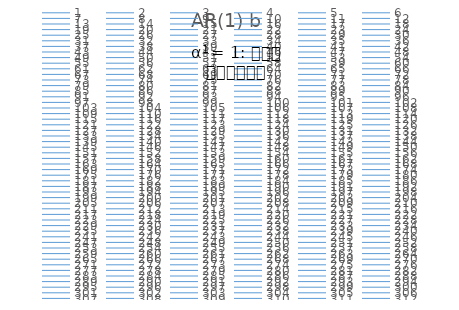
| Category | AR(1) b |
|---|---|
| 0 | 0 |
| 1 | 1.015 |
| 2 | 2.593 |
| 3 | 2.613 |
| 4 | 2.756 |
| 5 | 2.934 |
| 6 | 4.129 |
| 7 | 6.879 |
| 8 | 7.915 |
| 9 | 8.024 |
| 10 | 7.977 |
| 11 | 9.688 |
| 12 | 10.634 |
| 13 | 13.068 |
| 14 | 12.86 |
| 15 | 14.144 |
| 16 | 14.77 |
| 17 | 15.892 |
| 18 | 17.696 |
| 19 | 19.677 |
| 20 | 19.577 |
| 21 | 20.806 |
| 22 | 23.309 |
| 23 | 25.277 |
| 24 | 25.782 |
| 25 | 26.031 |
| 26 | 27.326 |
| 27 | 28.076 |
| 28 | 28.347 |
| 29 | 29.33 |
| 30 | 29.874 |
| 31 | 32.048 |
| 32 | 32.278 |
| 33 | 34.34 |
| 34 | 34.075 |
| 35 | 35.875 |
| 36 | 36.606 |
| 37 | 37.714 |
| 38 | 39.225 |
| 39 | 39.424 |
| 40 | 41.087 |
| 41 | 42.176 |
| 42 | 44.3 |
| 43 | 45.923 |
| 44 | 45.345 |
| 45 | 45.836 |
| 46 | 47.448 |
| 47 | 49.333 |
| 48 | 50.348 |
| 49 | 51.664 |
| 50 | 52.429 |
| 51 | 54.421 |
| 52 | 53.68 |
| 53 | 55.277 |
| 54 | 54.174 |
| 55 | 53.319 |
| 56 | 55.16 |
| 57 | 56.703 |
| 58 | 56.704 |
| 59 | 58.004 |
| 60 | 59.103 |
| 61 | 59.945 |
| 62 | 61.201 |
| 63 | 62.656 |
| 64 | 64.447 |
| 65 | 66.275 |
| 66 | 65.46 |
| 67 | 66.07 |
| 68 | 67.342 |
| 69 | 69.643 |
| 70 | 70.446 |
| 71 | 73.72 |
| 72 | 72.92 |
| 73 | 76.219 |
| 74 | 79.67 |
| 75 | 79.974 |
| 76 | 79.443 |
| 77 | 79.032 |
| 78 | 78.002 |
| 79 | 78.132 |
| 80 | 78.802 |
| 81 | 78.874 |
| 82 | 81.328 |
| 83 | 80.793 |
| 84 | 80.475 |
| 85 | 81.415 |
| 86 | 81.082 |
| 87 | 80.557 |
| 88 | 81.038 |
| 89 | 81.041 |
| 90 | 80.212 |
| 91 | 78.915 |
| 92 | 79.324 |
| 93 | 79.757 |
| 94 | 79.285 |
| 95 | 80.2 |
| 96 | 82.003 |
| 97 | 84.117 |
| 98 | 85.619 |
| 99 | 87.647 |
| 100 | 88.445 |
| 101 | 89.063 |
| 102 | 89.765 |
| 103 | 89.927 |
| 104 | 91.415 |
| 105 | 93.656 |
| 106 | 92.761 |
| 107 | 91.931 |
| 108 | 93.008 |
| 109 | 93.641 |
| 110 | 94.167 |
| 111 | 94.941 |
| 112 | 96.246 |
| 113 | 97.959 |
| 114 | 98.261 |
| 115 | 99.564 |
| 116 | 99.203 |
| 117 | 100.429 |
| 118 | 102.267 |
| 119 | 103.557 |
| 120 | 104.765 |
| 121 | 105.681 |
| 122 | 105.656 |
| 123 | 107.818 |
| 124 | 108.553 |
| 125 | 109.395 |
| 126 | 110.22 |
| 127 | 110.69 |
| 128 | 111.262 |
| 129 | 111.63 |
| 130 | 113.507 |
| 131 | 113.824 |
| 132 | 113.605 |
| 133 | 114.893 |
| 134 | 114.702 |
| 135 | 113.913 |
| 136 | 114.455 |
| 137 | 116.005 |
| 138 | 116.506 |
| 139 | 115.732 |
| 140 | 117.839 |
| 141 | 119.264 |
| 142 | 120.844 |
| 143 | 121.546 |
| 144 | 122.343 |
| 145 | 122.61 |
| 146 | 122.139 |
| 147 | 123.447 |
| 148 | 124.877 |
| 149 | 126.431 |
| 150 | 128.113 |
| 151 | 129.02 |
| 152 | 129.523 |
| 153 | 131.299 |
| 154 | 132.844 |
| 155 | 134.518 |
| 156 | 136.184 |
| 157 | 137.767 |
| 158 | 138.463 |
| 159 | 140.074 |
| 160 | 141.129 |
| 161 | 142.649 |
| 162 | 142.75 |
| 163 | 144.715 |
| 164 | 145.803 |
| 165 | 147.544 |
| 166 | 147.729 |
| 167 | 150.675 |
| 168 | 153.029 |
| 169 | 153.252 |
| 170 | 154.253 |
| 171 | 154.828 |
| 172 | 155.287 |
| 173 | 156.62 |
| 174 | 156.402 |
| 175 | 156.377 |
| 176 | 156.344 |
| 177 | 158.807 |
| 178 | 158.3 |
| 179 | 159.071 |
| 180 | 159.784 |
| 181 | 161.875 |
| 182 | 161.378 |
| 183 | 162.336 |
| 184 | 163.207 |
| 185 | 163.538 |
| 186 | 163.763 |
| 187 | 164.675 |
| 188 | 166.395 |
| 189 | 166.914 |
| 190 | 166.52 |
| 191 | 167.621 |
| 192 | 169.376 |
| 193 | 170.952 |
| 194 | 172.364 |
| 195 | 174.41 |
| 196 | 174.613 |
| 197 | 176.079 |
| 198 | 178.487 |
| 199 | 180.011 |
| 200 | 180.587 |
| 201 | 181.478 |
| 202 | 183.868 |
| 203 | 186.15 |
| 204 | 187.088 |
| 205 | 187.744 |
| 206 | 188.338 |
| 207 | 189.985 |
| 208 | 191.183 |
| 209 | 192.836 |
| 210 | 194.086 |
| 211 | 193.619 |
| 212 | 195.338 |
| 213 | 196.429 |
| 214 | 196.424 |
| 215 | 199.565 |
| 216 | 200.282 |
| 217 | 202.469 |
| 218 | 203.287 |
| 219 | 203.358 |
| 220 | 205.429 |
| 221 | 207.474 |
| 222 | 209.283 |
| 223 | 209.381 |
| 224 | 209.773 |
| 225 | 211.463 |
| 226 | 211.027 |
| 227 | 212.684 |
| 228 | 211.838 |
| 229 | 213.183 |
| 230 | 215.196 |
| 231 | 216.208 |
| 232 | 215.098 |
| 233 | 217.135 |
| 234 | 219.055 |
| 235 | 219.9 |
| 236 | 222.076 |
| 237 | 223.004 |
| 238 | 224.603 |
| 239 | 224.03 |
| 240 | 224.336 |
| 241 | 225.148 |
| 242 | 226.02 |
| 243 | 227.333 |
| 244 | 229.753 |
| 245 | 231.034 |
| 246 | 233.32 |
| 247 | 233.162 |
| 248 | 234.454 |
| 249 | 235.351 |
| 250 | 235.078 |
| 251 | 236.43 |
| 252 | 236.065 |
| 253 | 237.077 |
| 254 | 237.5 |
| 255 | 239.414 |
| 256 | 241.628 |
| 257 | 241.571 |
| 258 | 241.581 |
| 259 | 243.973 |
| 260 | 246.114 |
| 261 | 248.278 |
| 262 | 249.093 |
| 263 | 252.67 |
| 264 | 253.712 |
| 265 | 253.697 |
| 266 | 255.357 |
| 267 | 256.246 |
| 268 | 258.677 |
| 269 | 260.654 |
| 270 | 262.658 |
| 271 | 263.277 |
| 272 | 263.964 |
| 273 | 265.113 |
| 274 | 266.589 |
| 275 | 268.431 |
| 276 | 267.67 |
| 277 | 268.198 |
| 278 | 268.13 |
| 279 | 267.933 |
| 280 | 268.535 |
| 281 | 272.327 |
| 282 | 273.408 |
| 283 | 275.072 |
| 284 | 276.065 |
| 285 | 277.433 |
| 286 | 280.365 |
| 287 | 279.763 |
| 288 | 282.43 |
| 289 | 283.175 |
| 290 | 284.489 |
| 291 | 285.711 |
| 292 | 288.334 |
| 293 | 288.393 |
| 294 | 290.334 |
| 295 | 291.905 |
| 296 | 292.113 |
| 297 | 292 |
| 298 | 290.676 |
| 299 | 291.014 |
| 300 | 291.962 |
| 301 | 292.245 |
| 302 | 292.92 |
| 303 | 293.715 |
| 304 | 295.379 |
| 305 | 295.058 |
| 306 | 296.556 |
| 307 | 298.097 |
| 308 | 299.403 |
| 309 | 301.1 |
| 310 | 302.583 |
| 311 | 303.158 |
| 312 | 305.472 |
| 313 | 305.914 |
| 314 | 307.257 |
| 315 | 309.122 |
| 316 | 310.066 |
| 317 | 313.141 |
| 318 | 314.944 |
| 319 | 316.059 |
| 320 | 317.8 |
| 321 | 319.542 |
| 322 | 321.317 |
| 323 | 322.609 |
| 324 | 323.904 |
| 325 | 324.255 |
| 326 | 323.687 |
| 327 | 323.332 |
| 328 | 324.394 |
| 329 | 323.737 |
| 330 | 324.028 |
| 331 | 325.951 |
| 332 | 326.575 |
| 333 | 327.943 |
| 334 | 329.421 |
| 335 | 329.263 |
| 336 | 330.462 |
| 337 | 331.46 |
| 338 | 329.91 |
| 339 | 331.312 |
| 340 | 332.783 |
| 341 | 334.744 |
| 342 | 335.165 |
| 343 | 335.716 |
| 344 | 338.584 |
| 345 | 338.008 |
| 346 | 338.751 |
| 347 | 339.985 |
| 348 | 340.38 |
| 349 | 339.792 |
| 350 | 341.584 |
| 351 | 341.46 |
| 352 | 342.062 |
| 353 | 342.883 |
| 354 | 343.976 |
| 355 | 345.976 |
| 356 | 347.6 |
| 357 | 347.786 |
| 358 | 348.628 |
| 359 | 349.218 |
| 360 | 351.914 |
| 361 | 353.738 |
| 362 | 355.05 |
| 363 | 355.396 |
| 364 | 357.59 |
| 365 | 359.425 |
| 366 | 361.525 |
| 367 | 361.928 |
| 368 | 360.643 |
| 369 | 360.988 |
| 370 | 360.984 |
| 371 | 362.345 |
| 372 | 364.257 |
| 373 | 365.55 |
| 374 | 366.154 |
| 375 | 366.202 |
| 376 | 367.196 |
| 377 | 368.784 |
| 378 | 369.586 |
| 379 | 371.613 |
| 380 | 372.02 |
| 381 | 373.579 |
| 382 | 373.665 |
| 383 | 374.846 |
| 384 | 375.593 |
| 385 | 375.409 |
| 386 | 377.186 |
| 387 | 378.465 |
| 388 | 378.656 |
| 389 | 380.768 |
| 390 | 381.139 |
| 391 | 382.352 |
| 392 | 384.102 |
| 393 | 384.755 |
| 394 | 385.191 |
| 395 | 386.772 |
| 396 | 387.717 |
| 397 | 389.362 |
| 398 | 389.15 |
| 399 | 390.369 |
| 400 | 390.833 |
| 401 | 392.148 |
| 402 | 391.234 |
| 403 | 391.96 |
| 404 | 392.983 |
| 405 | 395.067 |
| 406 | 397.329 |
| 407 | 396.385 |
| 408 | 397.003 |
| 409 | 398.568 |
| 410 | 401.656 |
| 411 | 404.565 |
| 412 | 406.17 |
| 413 | 406.298 |
| 414 | 407.691 |
| 415 | 409.139 |
| 416 | 411.92 |
| 417 | 414.071 |
| 418 | 416.994 |
| 419 | 417.515 |
| 420 | 417.923 |
| 421 | 417.814 |
| 422 | 417.919 |
| 423 | 419.449 |
| 424 | 419.171 |
| 425 | 421.136 |
| 426 | 422.283 |
| 427 | 423.513 |
| 428 | 423.971 |
| 429 | 425.452 |
| 430 | 427.013 |
| 431 | 428.475 |
| 432 | 430.255 |
| 433 | 431.982 |
| 434 | 433.965 |
| 435 | 435.609 |
| 436 | 436.619 |
| 437 | 437.464 |
| 438 | 439.019 |
| 439 | 441.583 |
| 440 | 442.332 |
| 441 | 442.475 |
| 442 | 443.395 |
| 443 | 444.824 |
| 444 | 445.809 |
| 445 | 447.546 |
| 446 | 448.847 |
| 447 | 450.032 |
| 448 | 449.491 |
| 449 | 450.614 |
| 450 | 450.52 |
| 451 | 451.356 |
| 452 | 452.417 |
| 453 | 453.309 |
| 454 | 454.142 |
| 455 | 455.05 |
| 456 | 454.995 |
| 457 | 456.901 |
| 458 | 459.316 |
| 459 | 457.51 |
| 460 | 458.253 |
| 461 | 458.883 |
| 462 | 460.108 |
| 463 | 460.199 |
| 464 | 460.583 |
| 465 | 462.586 |
| 466 | 463.832 |
| 467 | 463.729 |
| 468 | 463.229 |
| 469 | 463.522 |
| 470 | 464.883 |
| 471 | 465.7 |
| 472 | 467.804 |
| 473 | 467.032 |
| 474 | 467.564 |
| 475 | 468.868 |
| 476 | 469.617 |
| 477 | 471.316 |
| 478 | 472.33 |
| 479 | 475.036 |
| 480 | 477.85 |
| 481 | 478.332 |
| 482 | 479.799 |
| 483 | 479.774 |
| 484 | 480.866 |
| 485 | 480.323 |
| 486 | 482.018 |
| 487 | 484.964 |
| 488 | 485.003 |
| 489 | 487.082 |
| 490 | 487.771 |
| 491 | 490.247 |
| 492 | 491.771 |
| 493 | 493.603 |
| 494 | 493.783 |
| 495 | 495.096 |
| 496 | 495.491 |
| 497 | 496.331 |
| 498 | 497.402 |
| 499 | 498.09 |
| 500 | 498.751 |
| 501 | 498.765 |
| 502 | 498.929 |
| 503 | 501.525 |
| 504 | 501.977 |
| 505 | 502.309 |
| 506 | 502.129 |
| 507 | 504.072 |
| 508 | 506.53 |
| 509 | 506.908 |
| 510 | 505.813 |
| 511 | 506.227 |
| 512 | 506.285 |
| 513 | 507.825 |
| 514 | 509.331 |
| 515 | 510.477 |
| 516 | 512.352 |
| 517 | 511.131 |
| 518 | 512.456 |
| 519 | 513.735 |
| 520 | 513.937 |
| 521 | 516.262 |
| 522 | 515.575 |
| 523 | 515.715 |
| 524 | 516.759 |
| 525 | 517.656 |
| 526 | 518.931 |
| 527 | 522.027 |
| 528 | 523.219 |
| 529 | 523.583 |
| 530 | 524.544 |
| 531 | 525.423 |
| 532 | 527.055 |
| 533 | 528.744 |
| 534 | 529.528 |
| 535 | 530.534 |
| 536 | 531.365 |
| 537 | 532.998 |
| 538 | 534.556 |
| 539 | 536.079 |
| 540 | 537.398 |
| 541 | 541.347 |
| 542 | 542.794 |
| 543 | 543.862 |
| 544 | 543.303 |
| 545 | 543.352 |
| 546 | 544.015 |
| 547 | 546.171 |
| 548 | 547.365 |
| 549 | 548.53 |
| 550 | 550.045 |
| 551 | 551.048 |
| 552 | 551.118 |
| 553 | 551.406 |
| 554 | 551.578 |
| 555 | 552.655 |
| 556 | 554.51 |
| 557 | 556.36 |
| 558 | 558.445 |
| 559 | 559.444 |
| 560 | 560.959 |
| 561 | 562.092 |
| 562 | 563.25 |
| 563 | 565.704 |
| 564 | 567.061 |
| 565 | 567.363 |
| 566 | 568.737 |
| 567 | 569.714 |
| 568 | 570.332 |
| 569 | 569.839 |
| 570 | 572.47 |
| 571 | 574.561 |
| 572 | 574.963 |
| 573 | 576.131 |
| 574 | 575.574 |
| 575 | 576.406 |
| 576 | 576.687 |
| 577 | 575.754 |
| 578 | 578.128 |
| 579 | 578.515 |
| 580 | 577.302 |
| 581 | 578.21 |
| 582 | 577.995 |
| 583 | 581.177 |
| 584 | 583.21 |
| 585 | 584.484 |
| 586 | 586.021 |
| 587 | 584.889 |
| 588 | 585.752 |
| 589 | 587.481 |
| 590 | 588.703 |
| 591 | 591.391 |
| 592 | 590.447 |
| 593 | 591.958 |
| 594 | 592.94 |
| 595 | 594.098 |
| 596 | 597.532 |
| 597 | 599.314 |
| 598 | 598.119 |
| 599 | 599.068 |
| 600 | 599.074 |